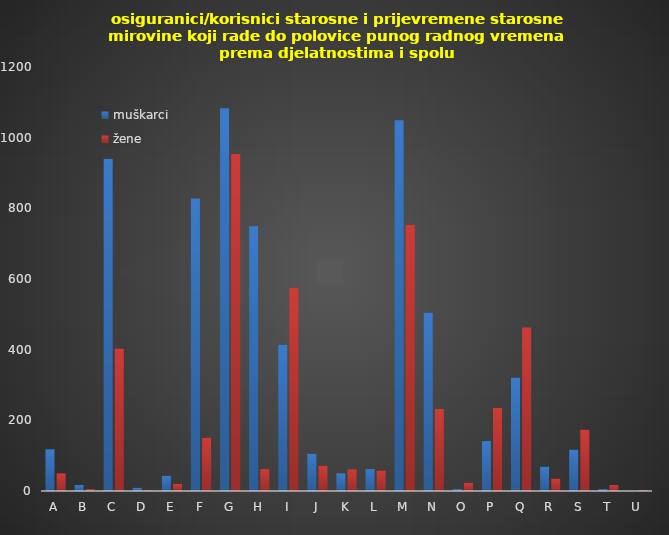
| Category | muškarci | žene |
|---|---|---|
| A | 118 | 50 |
| B | 17 | 5 |
| C | 940 | 403 |
| D | 9 | 2 |
| E | 43 | 20 |
| F | 828 | 151 |
| G | 1083 | 954 |
| H | 749 | 62 |
| I | 414 | 575 |
| J | 106 | 72 |
| K | 50 | 61 |
| L | 62 | 58 |
| M | 1049 | 753 |
| N | 505 | 232 |
| O | 5 | 23 |
| P | 141 | 235 |
| Q | 321 | 463 |
| R | 69 | 35 |
| S | 117 | 174 |
| T | 5 | 17 |
| U | 0 | 2 |